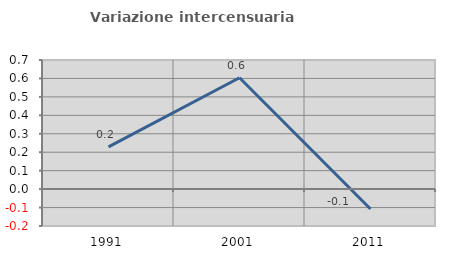
| Category | Variazione intercensuaria annua |
|---|---|
| 1991.0 | 0.229 |
| 2001.0 | 0.604 |
| 2011.0 | -0.108 |